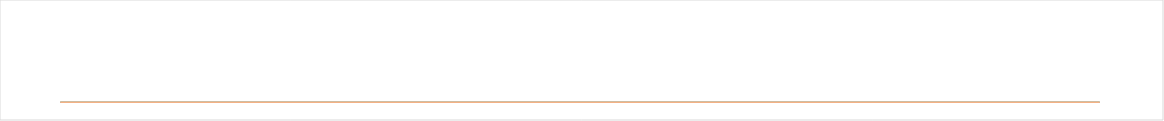
| Category | Ingresos | Ahorros | Gastos |
|---|---|---|---|
|  Ene  | 0 | 0 | 0 |
|  Feb  | 0 | 0 | 0 |
|  Mar  | 0 | 0 | 0 |
|  Abr  | 0 | 0 | 0 |
|  May  | 0 | 0 | 0 |
|  Jun  | 0 | 0 | 0 |
|  Jul  | 0 | 0 | 0 |
|  Ago  | 0 | 0 | 0 |
|  Sept  | 0 | 0 | 0 |
|  Oct  | 0 | 0 | 0 |
|  Nov  | 0 | 0 | 0 |
|  Dic  | 0 | 0 | 0 |